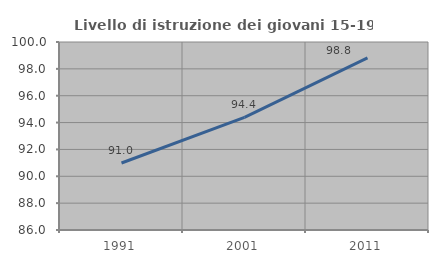
| Category | Livello di istruzione dei giovani 15-19 anni |
|---|---|
| 1991.0 | 90.991 |
| 2001.0 | 94.382 |
| 2011.0 | 98.824 |